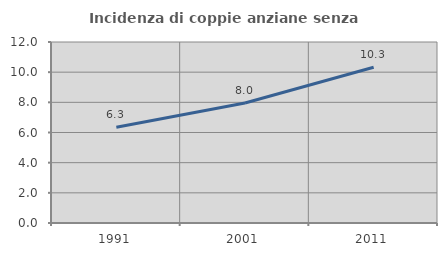
| Category | Incidenza di coppie anziane senza figli  |
|---|---|
| 1991.0 | 6.342 |
| 2001.0 | 7.952 |
| 2011.0 | 10.321 |